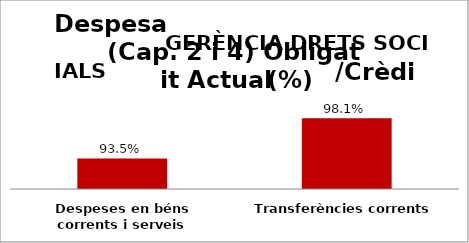
| Category | Series 0 |
|---|---|
| Despeses en béns corrents i serveis | 0.935 |
| Transferències corrents | 0.981 |